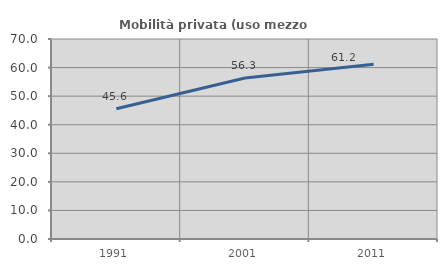
| Category | Mobilità privata (uso mezzo privato) |
|---|---|
| 1991.0 | 45.613 |
| 2001.0 | 56.345 |
| 2011.0 | 61.19 |